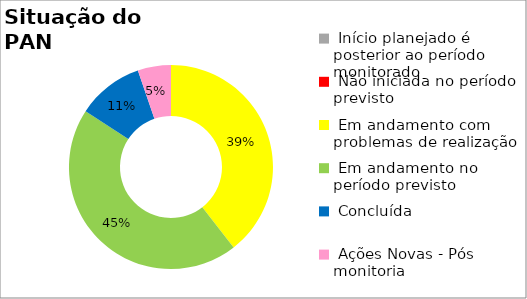
| Category | Series 0 |
|---|---|
|  Início planejado é posterior ao período monitorado | 0 |
|  Não iniciada no período previsto | 0 |
|  Em andamento com problemas de realização | 0.395 |
|  Em andamento no período previsto  | 0.447 |
|  Concluída | 0.105 |
|  Ações Novas - Pós monitoria | 0.053 |